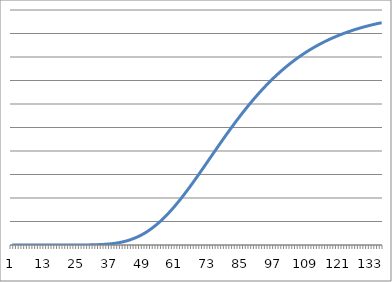
| Category | Series 0 |
|---|---|
| 0 | 1 |
| 1 | 10.785 |
| 2 | 11.343 |
| 3 | 35.222 |
| 4 | 103.937 |
| 5 | 292.144 |
| 6 | 783.871 |
| 7 | 2011.971 |
| 8 | 4949.87 |
| 9 | 11694.687 |
| 10 | 26582.526 |
| 11 | 58233.319 |
| 12 | 123150.232 |
| 13 | 251811.585 |
| 14 | 498597.843 |
| 15 | 957386.218 |
| 16 | 1785195.082 |
| 17 | 3236820.487 |
| 18 | 5713903.6 |
| 19 | 9832204.834 |
| 20 | 16510928.891 |
| 21 | 27087636.722 |
| 22 | 43461505.408 |
| 23 | 68266402.356 |
| 24 | 105073426.384 |
| 25 | 158620300.191 |
| 26 | 235062408.463 |
| 27 | 342237555.63 |
| 28 | 489933902.917 |
| 29 | 690148291.094 |
| 30 | 957320509.514 |
| 31 | 1308528242.066 |
| 32 | 1763627551.85 |
| 33 | 2345324923.061 |
| 34 | 3079169035.685 |
| 35 | 3993453493.104 |
| 36 | 5119025465.525 |
| 37 | 6488999406.862 |
| 38 | 8138379369.974 |
| 39 | 10103597698.644 |
| 40 | 12421981745.975 |
| 41 | 15131163528.511 |
| 42 | 18268449698.894 |
| 43 | 21870170796.523 |
| 44 | 25971029371.822 |
| 45 | 30603466295.091 |
| 46 | 35797063430.84 |
| 47 | 41577999002.61 |
| 48 | 47968569541.944 |
| 49 | 54986789475.998 |
| 50 | 62646076333.116 |
| 51 | 70955026399.123 |
| 52 | 79917282587.769 |
| 53 | 89531493422.448 |
| 54 | 99791359462.498 |
| 55 | 110685761317.278 |
| 56 | 122198961618.47 |
| 57 | 134310871983.957 |
| 58 | 146997375100.899 |
| 59 | 160230691559.002 |
| 60 | 173979780940.711 |
| 61 | 188210766876.759 |
| 62 | 202887376250.733 |
| 63 | 217971383430.031 |
| 64 | 233423051258.404 |
| 65 | 249201561515.355 |
| 66 | 265265428582.772 |
| 67 | 281572891117.615 |
| 68 | 298082277575.969 |
| 69 | 314752342439.293 |
| 70 | 331542570935.948 |
| 71 | 348413450913.515 |
| 72 | 365326711289.083 |
| 73 | 382245527179.485 |
| 74 | 399134692389.299 |
| 75 | 415960760412.645 |
| 76 | 432692155489.314 |
| 77 | 449299255552.592 |
| 78 | 465754449122.585 |
| 79 | 482032168343.119 |
| 80 | 498108900441.234 |
| 81 | 513963179914.413 |
| 82 | 529575563730.889 |
| 83 | 544928591770.517 |
| 84 | 560006734645.658 |
| 85 | 574796330930.007 |
| 86 | 589285515694.73 |
| 87 | 603464142110.896 |
| 88 | 617323697729.94 |
| 89 | 630857216903.573 |
| 90 | 644059190654.62 |
| 91 | 656925475163.314 |
| 92 | 669453199891.837 |
| 93 | 681640676234.881 |
| 94 | 693487307456.999 |
| 95 | 704993500559.258 |
| 96 | 716160580608.712 |
| 97 | 726990707964.703 |
| 98 | 737486798745.913 |
| 99 | 747652448801.326 |
| 100 | 757491861376.455 |
| 101 | 767009778602.883 |
| 102 | 776211416883.996 |
| 103 | 785102406202.031 |
| 104 | 793688733330.809 |
| 105 | 801976688904.09 |
| 106 | 809972818260.823 |
| 107 | 817683875965.117 |
| 108 | 825116783879.952 |
| 109 | 832278592658.96 |
| 110 | 839176446509.575 |
| 111 | 845817551073.001 |
| 112 | 852209144261.304 |
| 113 | 858358469889.234 |
| 114 | 864272753937.637 |
| 115 | 869959183286.291 |
| 116 | 875424886756.377 |
| 117 | 880676918306.345 |
| 118 | 885722242229.376 |
| 119 | 890567720205.865 |
| 120 | 895220100070.077 |
| 121 | 899686006156.307 |
| 122 | 903971931096.304 |
| 123 | 908084228946.331 |
| 124 | 912029109528.907 |
| 125 | 915812633880.956 |
| 126 | 919440710706.697 |
| 127 | 922919093740.07 |
| 128 | 926253379927.847 |
| 129 | 929449008350.656 |
| 130 | 932511259805.053 |
| 131 | 935445256975.42 |
| 132 | 938255965129.874 |
| 133 | 940948193279.436 |
| 134 | 943526595744.646 |
| 135 | 945995674078.299 |